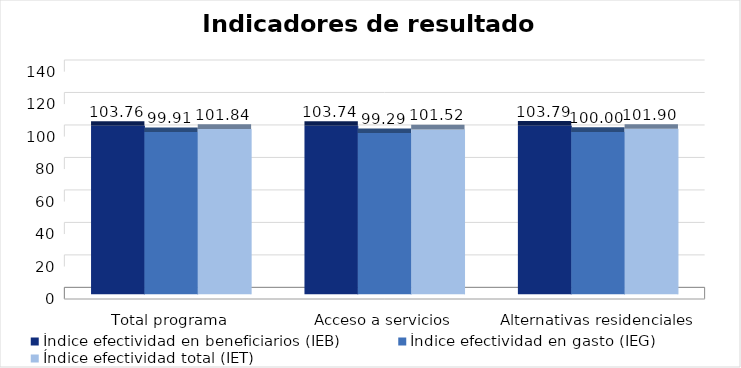
| Category | Índice efectividad en beneficiarios (IEB) | Índice efectividad en gasto (IEG)  | Índice efectividad total (IET) |
|---|---|---|---|
| Total programa | 103.764 | 99.908 | 101.836 |
| Acceso a servicios | 103.74 | 99.294 | 101.517 |
| Alternativas residenciales | 103.791 | 100 | 101.896 |